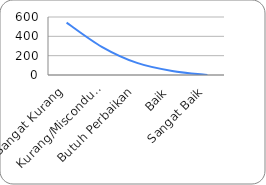
| Category | Pola Distribusi |
|---|---|
| Sangat Kurang | 541.667 |
| Kurang/Misconduct | 291.667 |
| Butuh Perbaikan | 125 |
| Baik | 41.667 |
| Sangat Baik | 0 |